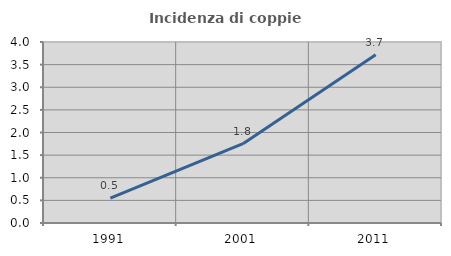
| Category | Incidenza di coppie miste |
|---|---|
| 1991.0 | 0.547 |
| 2001.0 | 1.752 |
| 2011.0 | 3.717 |